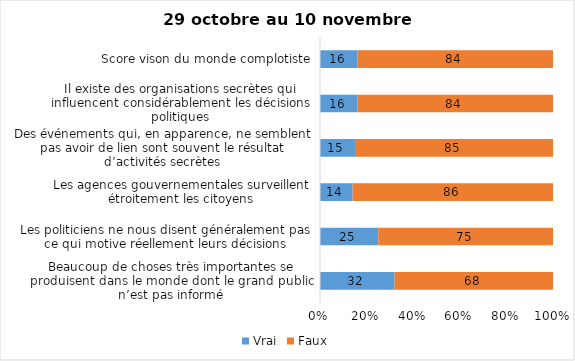
| Category | Vrai | Faux |
|---|---|---|
| Beaucoup de choses très importantes se produisent dans le monde dont le grand public n’est pas informé | 32 | 68 |
| Les politiciens ne nous disent généralement pas ce qui motive réellement leurs décisions | 25 | 75 |
| Les agences gouvernementales surveillent étroitement les citoyens | 14 | 86 |
| Des événements qui, en apparence, ne semblent pas avoir de lien sont souvent le résultat d’activités secrètes | 15 | 85 |
| Il existe des organisations secrètes qui influencent considérablement les décisions politiques | 16 | 84 |
| Score vison du monde complotiste | 16 | 84 |